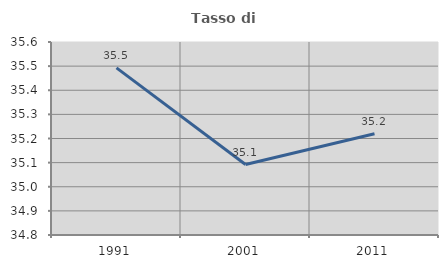
| Category | Tasso di occupazione   |
|---|---|
| 1991.0 | 35.493 |
| 2001.0 | 35.092 |
| 2011.0 | 35.22 |